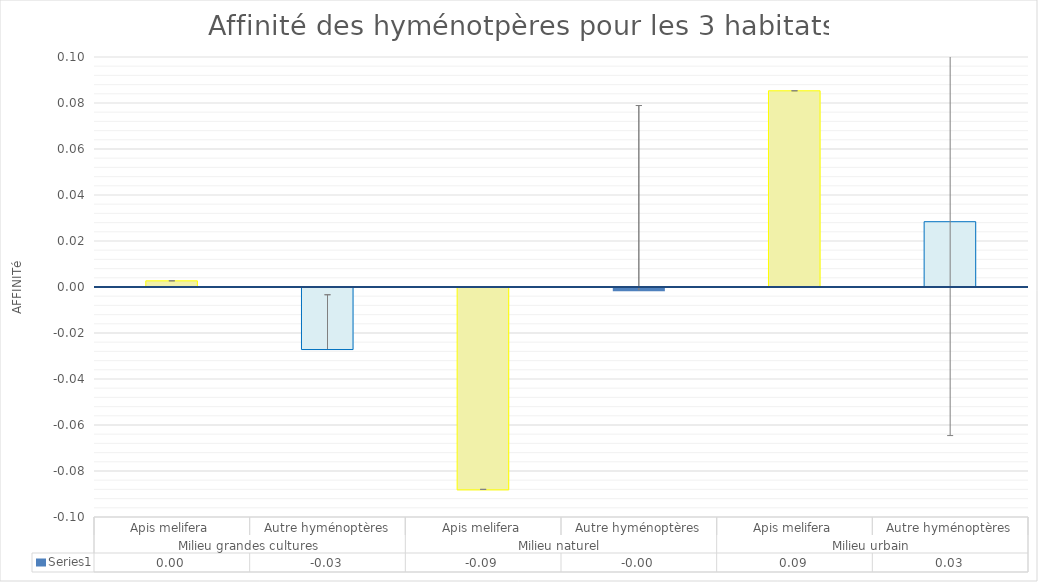
| Category | Series 0 |
|---|---|
| 0 | 0.003 |
| 1 | -0.027 |
| 2 | -0.088 |
| 3 | -0.001 |
| 4 | 0.085 |
| 5 | 0.028 |